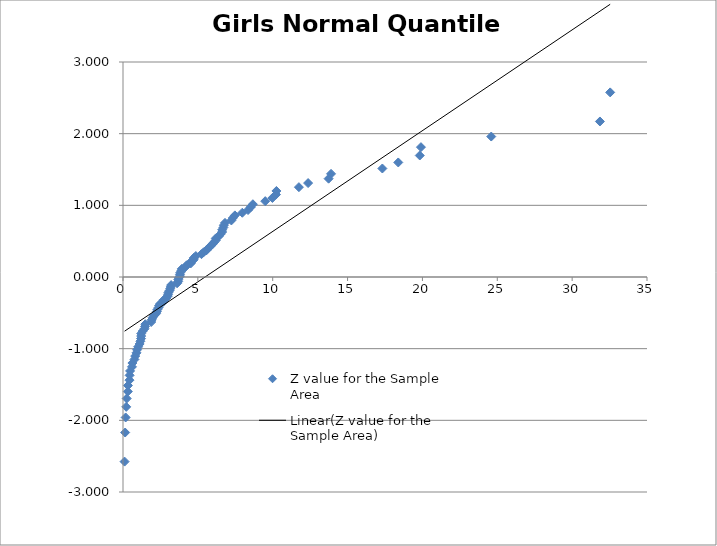
| Category | Z value for the Sample Area |
|---|---|
| 0.10617347833597046 | -2.576 |
| 0.1446230772550999 | -2.17 |
| 0.17809795473046336 | -1.96 |
| 0.2152354505873876 | -1.812 |
| 0.24775919469074814 | -1.695 |
| 0.32247397762289803 | -1.598 |
| 0.3306303675085318 | -1.514 |
| 0.43167142809772474 | -1.44 |
| 0.44177517352914464 | -1.372 |
| 0.47303315210745117 | -1.311 |
| 0.599635928677635 | -1.254 |
| 0.6273588960947679 | -1.2 |
| 0.7660249273523267 | -1.15 |
| 0.8157521958008693 | -1.103 |
| 0.900333549760494 | -1.058 |
| 0.9392129902450624 | -1.015 |
| 1.0133276589797275 | -0.974 |
| 1.1104987124815546 | -0.935 |
| 1.1624048156072675 | -0.896 |
| 1.2049119600852158 | -0.86 |
| 1.215604367589187 | -0.824 |
| 1.2163529624744767 | -0.789 |
| 1.3119379178439996 | -0.755 |
| 1.4378617430743137 | -0.722 |
| 1.4711591952031835 | -0.69 |
| 1.4919282857857312 | -0.659 |
| 1.8839991407352834 | -0.628 |
| 1.9204279510208977 | -0.598 |
| 1.9744459073044485 | -0.568 |
| 2.06948364367334 | -0.539 |
| 2.210810319069708 | -0.51 |
| 2.260123295135906 | -0.482 |
| 2.2961893123242714 | -0.454 |
| 2.3756304582746024 | -0.426 |
| 2.4123691411676913 | -0.399 |
| 2.491875630581967 | -0.372 |
| 2.6999679929811915 | -0.345 |
| 2.726550477674421 | -0.319 |
| 2.9022708024814126 | -0.292 |
| 2.993989914113112 | -0.266 |
| 3.0089921929637367 | -0.24 |
| 3.033165585902734 | -0.215 |
| 3.1115994612817186 | -0.189 |
| 3.1541663631953765 | -0.164 |
| 3.191854840103613 | -0.138 |
| 3.216150582351465 | -0.113 |
| 3.614008152675091 | -0.088 |
| 3.6860842325914693 | -0.063 |
| 3.6925894028661976 | -0.038 |
| 3.7235478833287092 | -0.013 |
| 3.8017365114342536 | 0.013 |
| 3.8038807958358003 | 0.038 |
| 3.8283407640421077 | 0.063 |
| 3.903881911738424 | 0.088 |
| 3.9277095978731444 | 0.113 |
| 4.159452653267087 | 0.138 |
| 4.24973395149767 | 0.164 |
| 4.522791472827146 | 0.189 |
| 4.547562342632775 | 0.215 |
| 4.716968738118925 | 0.24 |
| 4.729885782452585 | 0.266 |
| 4.864236583424023 | 0.292 |
| 5.2421218504374805 | 0.319 |
| 5.384606301224812 | 0.345 |
| 5.572358206982246 | 0.372 |
| 5.681148438813146 | 0.399 |
| 5.828600138206595 | 0.426 |
| 5.957326540188745 | 0.454 |
| 6.066156072187538 | 0.482 |
| 6.194493092889422 | 0.51 |
| 6.196595171487702 | 0.539 |
| 6.395898237691593 | 0.568 |
| 6.513457981702436 | 0.598 |
| 6.622466450801699 | 0.628 |
| 6.625274162101234 | 0.659 |
| 6.705999184062852 | 0.69 |
| 6.734026045638529 | 0.722 |
| 6.813695005409752 | 0.755 |
| 7.239141862838868 | 0.789 |
| 7.3367565108078825 | 0.824 |
| 7.472412117748838 | 0.86 |
| 7.967445308976232 | 0.896 |
| 8.35059200573389 | 0.935 |
| 8.529456277999993 | 0.974 |
| 8.67590176850804 | 1.015 |
| 9.49935383868143 | 1.058 |
| 9.98131860586739 | 1.103 |
| 10.219569051038983 | 1.15 |
| 10.246904488077387 | 1.2 |
| 11.749531701238705 | 1.254 |
| 12.363512612099191 | 1.311 |
| 13.73341036931887 | 1.372 |
| 13.89734258838002 | 1.44 |
| 17.324178141096247 | 1.514 |
| 18.386393494907875 | 1.598 |
| 19.821510591144193 | 1.695 |
| 19.900826334274146 | 1.812 |
| 24.597451776697724 | 1.96 |
| 31.856247071978636 | 2.17 |
| 32.540464607729206 | 2.576 |